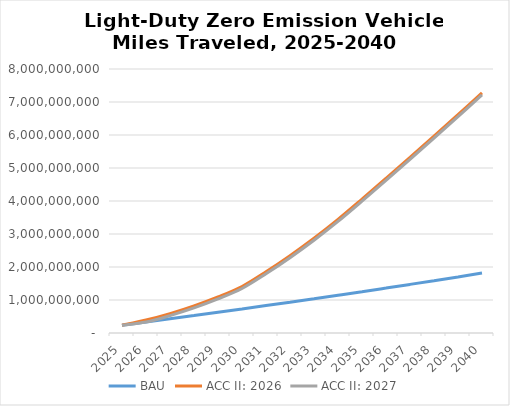
| Category | BAU | ACC II: 2026 | ACC II: 2027 |
|---|---|---|---|
| 2025.0 | 235465688.414 | 235465688.414 | 235465688.414 |
| 2026.0 | 332379186.151 | 392910550.925 | 332379186.151 |
| 2027.0 | 430236271.666 | 588043802.76 | 527383086.823 |
| 2028.0 | 529039205.307 | 821496481.715 | 760707146.084 |
| 2029.0 | 628771911.588 | 1093869355.053 | 1032953458.615 |
| 2030.0 | 729442363.857 | 1410419334.918 | 1349377523.347 |
| 2031.0 | 831294502.626 | 1856789973.404 | 1795624451.747 |
| 2032.0 | 934361788.099 | 2343903796.675 | 2282614760.614 |
| 2033.0 | 1038645076.451 | 2872571670.373 | 2811160020.317 |
| 2034.0 | 1144129093.071 | 3443557542.57 | 3382025499.284 |
| 2035.0 | 1250880469.146 | 4057878761.875 | 3996225388.171 |
| 2036.0 | 1361303015.18 | 4686852672.155 | 4624949637.309 |
| 2037.0 | 1472951769.404 | 5323096686.881 | 5260946694.84 |
| 2038.0 | 1585873829.747 | 5966770339.529 | 5904373902.275 |
| 2039.0 | 1699982192.838 | 6617539953.172 | 6554900884.424 |
| 2040.0 | 1815369526.103 | 7275750634.121 | 7212869033.498 |